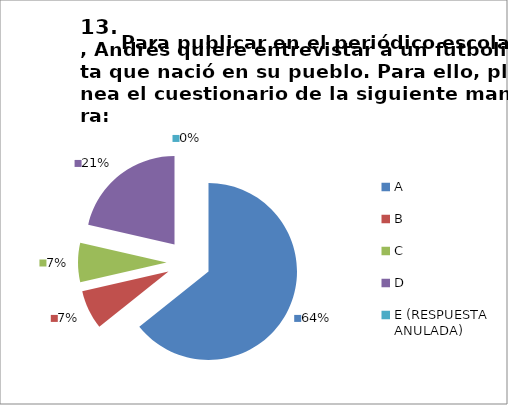
| Category | CANTIDAD DE RESPUESTAS PREGUNTA (13) | PORCENTAJE |
|---|---|---|
| A | 18 | 0.643 |
| B | 2 | 0.071 |
| C | 2 | 0.071 |
| D | 6 | 0.214 |
| E (RESPUESTA ANULADA) | 0 | 0 |